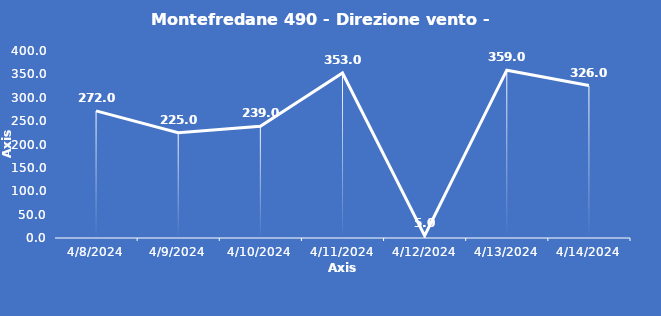
| Category | Montefredane 490 - Direzione vento - Grezzo (°N) |
|---|---|
| 4/8/24 | 272 |
| 4/9/24 | 225 |
| 4/10/24 | 239 |
| 4/11/24 | 353 |
| 4/12/24 | 5 |
| 4/13/24 | 359 |
| 4/14/24 | 326 |